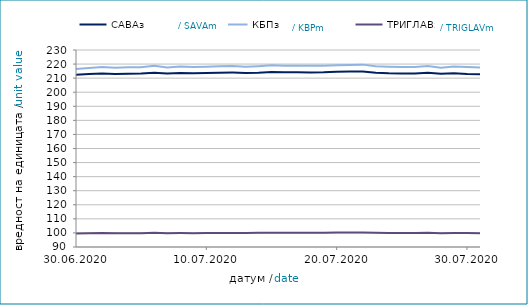
| Category | САВАз | КБПз | ТРИГЛАВз |
|---|---|---|---|
| 2020-06-30 | 212.475 | 216.508 | 99.552 |
| 2020-07-01 | 212.886 | 217.282 | 99.75 |
| 2020-07-02 | 213.336 | 217.907 | 99.904 |
| 2020-07-03 | 213.006 | 217.441 | 99.754 |
| 2020-07-04 | 213.207 | 217.77 | 99.84 |
| 2020-07-05 | 213.219 | 217.783 | 99.845 |
| 2020-07-06 | 213.906 | 218.877 | 100.088 |
| 2020-07-07 | 213.273 | 217.623 | 99.82 |
| 2020-07-08 | 213.612 | 218.301 | 99.912 |
| 2020-07-09 | 213.414 | 217.881 | 99.838 |
| 2020-07-10 | 213.696 | 218.183 | 99.938 |
| 2020-07-11 | 213.91 | 218.538 | 100.032 |
| 2020-07-12 | 213.923 | 218.55 | 100.036 |
| 2020-07-13 | 213.736 | 218.13 | 100.003 |
| 2020-07-14 | 213.916 | 218.537 | 100.068 |
| 2020-07-15 | 214.305 | 219.078 | 100.185 |
| 2020-07-16 | 214.12 | 218.747 | 100.153 |
| 2020-07-17 | 214.109 | 218.782 | 100.187 |
| 2020-07-18 | 214.088 | 218.727 | 100.175 |
| 2020-07-19 | 214.101 | 218.739 | 100.179 |
| 2020-07-20 | 214.572 | 219.207 | 100.297 |
| 2020-07-21 | 214.665 | 219.387 | 100.34 |
| 2020-07-22 | 214.674 | 219.606 | 100.39 |
| 2020-07-23 | 213.896 | 218.407 | 100.155 |
| 2020-07-24 | 213.466 | 218.047 | 100.023 |
| 2020-07-25 | 213.367 | 217.867 | 99.982 |
| 2020-07-26 | 213.38 | 217.879 | 99.986 |
| 2020-07-27 | 213.838 | 218.556 | 100.063 |
| 2020-07-28 | 213.053 | 217.352 | 99.822 |
| 2020-07-29 | 213.444 | 218.356 | 100.012 |
| 2020-07-30 | 212.941 | 217.849 | 99.874 |
| 2020-07-31 | 212.719 | 217.502 | 99.836 |